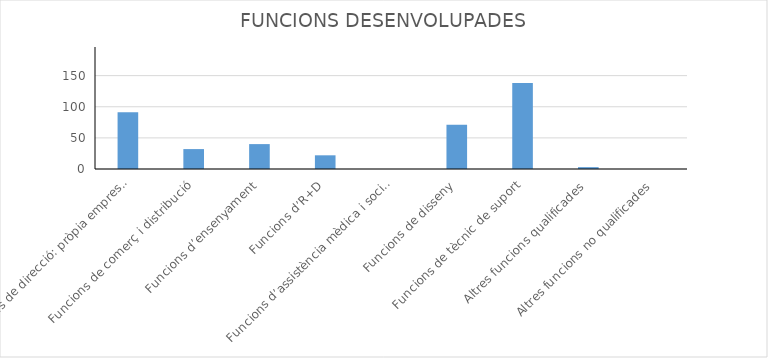
| Category | Series 0 |
|---|---|
| Funcions de direcció: pròpia empresa, direcció, producció, financera, etc. | 91 |
| Funcions de comerç i distribució | 32 |
| Funcions d’ensenyament | 40 |
| Funcions d’R+D | 22 |
| Funcions d’assistència mèdica i social | 0 |
| Funcions de disseny | 71 |
| Funcions de tècnic de suport | 138 |
| Altres funcions qualificades | 3 |
| Altres funcions no qualificades | 0 |